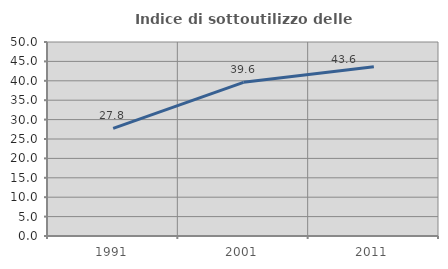
| Category | Indice di sottoutilizzo delle abitazioni  |
|---|---|
| 1991.0 | 27.759 |
| 2001.0 | 39.601 |
| 2011.0 | 43.641 |